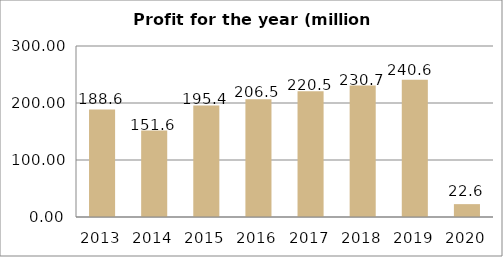
| Category | Series 0 |
|---|---|
| 2013.0 | 188.6 |
| 2014.0 | 151.6 |
| 2015.0 | 195.4 |
| 2016.0 | 206.5 |
| 2017.0 | 220.5 |
| 2018.0 | 230.7 |
| 2019.0 | 240.6 |
| 2020.0 | 22.57 |